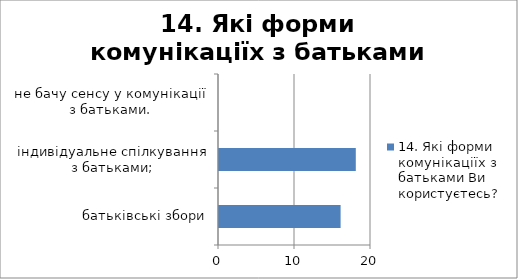
| Category | 14. Які форми комунікаціїх з батьками Ви користуєтесь? |
|---|---|
| батьківські збори | 16 |
| індивідуальне спілкування з батьками; | 18 |
| не бачу сенсу у комунікації з батьками. | 0 |